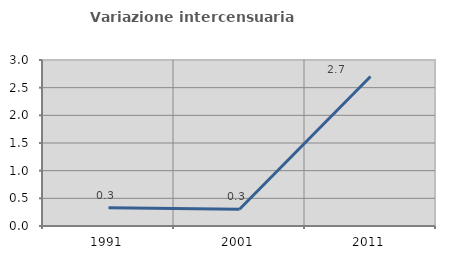
| Category | Variazione intercensuaria annua |
|---|---|
| 1991.0 | 0.332 |
| 2001.0 | 0.303 |
| 2011.0 | 2.701 |